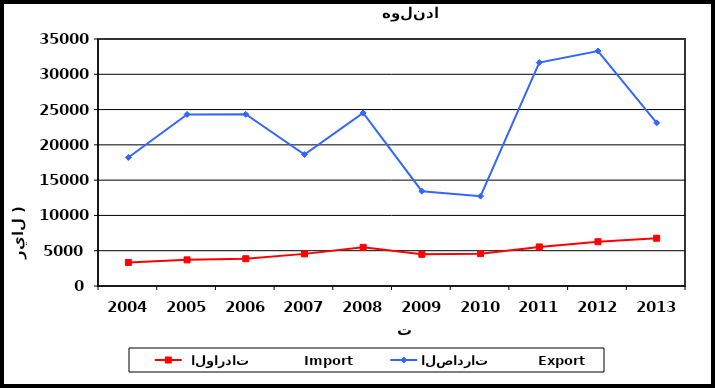
| Category |  الواردات           Import | الصادرات          Export |
|---|---|---|
| 2004.0 | 3338 | 18216 |
| 2005.0 | 3703 | 24308 |
| 2006.0 | 3865 | 24331 |
| 2007.0 | 4552 | 18630 |
| 2008.0 | 5479 | 24529 |
| 2009.0 | 4494 | 13436 |
| 2010.0 | 4582 | 12730 |
| 2011.0 | 5534 | 31667 |
| 2012.0 | 6274 | 33298 |
| 2013.0 | 6771 | 23113 |